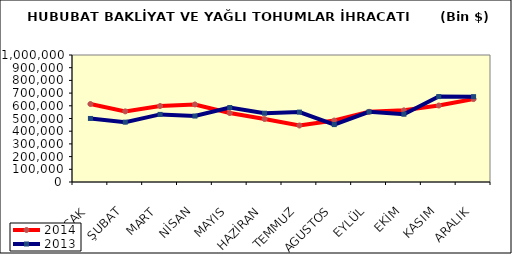
| Category | 2014 | 2013 |
|---|---|---|
| OCAK | 614049.99 | 500356.073 |
| ŞUBAT | 556283.597 | 471153.276 |
| MART | 598289.294 | 532314.25 |
| NİSAN | 610736.33 | 519233.696 |
| MAYIS | 543074.733 | 586423.342 |
| HAZİRAN | 495849.454 | 541613.938 |
| TEMMUZ | 444873.03 | 550415.771 |
| AGUSTOS | 484024.742 | 452060.286 |
| EYLÜL | 552617.034 | 552548.789 |
| EKİM | 564268.113 | 533746.576 |
| KASIM | 602188.624 | 672663.617 |
| ARALIK | 652884.789 | 672112.711 |